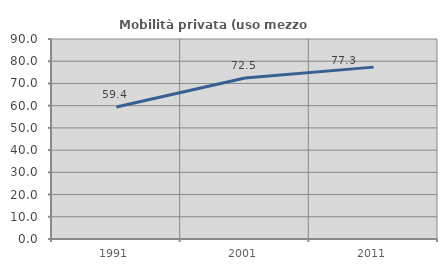
| Category | Mobilità privata (uso mezzo privato) |
|---|---|
| 1991.0 | 59.394 |
| 2001.0 | 72.477 |
| 2011.0 | 77.344 |